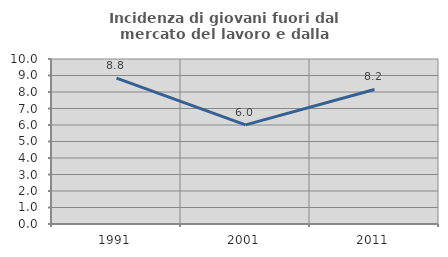
| Category | Incidenza di giovani fuori dal mercato del lavoro e dalla formazione  |
|---|---|
| 1991.0 | 8.841 |
| 2001.0 | 6.005 |
| 2011.0 | 8.152 |